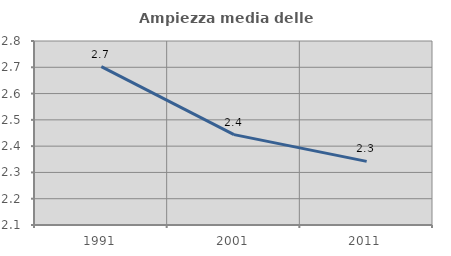
| Category | Ampiezza media delle famiglie |
|---|---|
| 1991.0 | 2.703 |
| 2001.0 | 2.444 |
| 2011.0 | 2.342 |